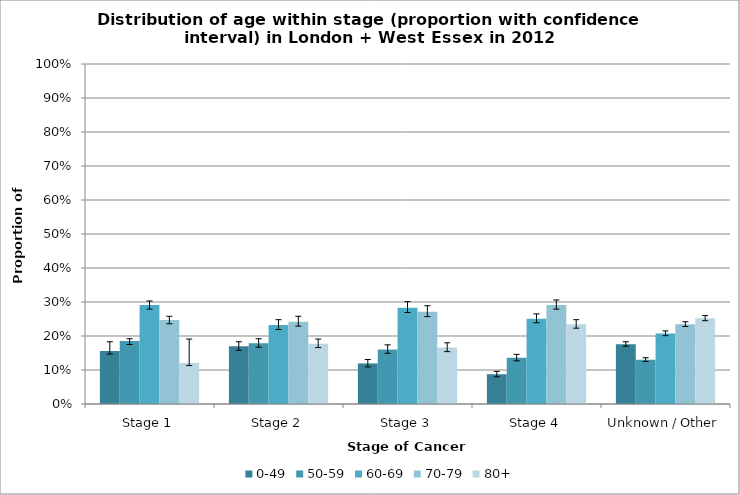
| Category | 0-49 | 50-59 | 60-69 | 70-79 | 80+ |
|---|---|---|---|---|---|
| Stage 1 | 0.156 | 0.185 | 0.291 | 0.247 | 0.121 |
| Stage 2 | 0.17 | 0.178 | 0.232 | 0.242 | 0.178 |
| Stage 3 | 0.119 | 0.16 | 0.283 | 0.271 | 0.166 |
| Stage 4 | 0.088 | 0.136 | 0.251 | 0.291 | 0.235 |
| Unknown / Other | 0.176 | 0.13 | 0.208 | 0.235 | 0.252 |